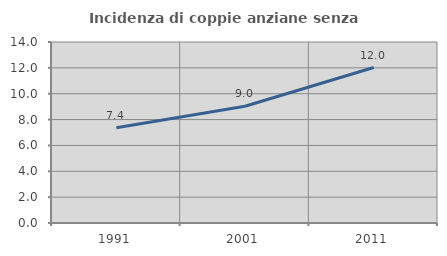
| Category | Incidenza di coppie anziane senza figli  |
|---|---|
| 1991.0 | 7.361 |
| 2001.0 | 9.035 |
| 2011.0 | 12.026 |